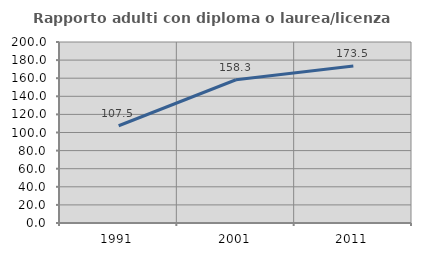
| Category | Rapporto adulti con diploma o laurea/licenza media  |
|---|---|
| 1991.0 | 107.469 |
| 2001.0 | 158.264 |
| 2011.0 | 173.469 |